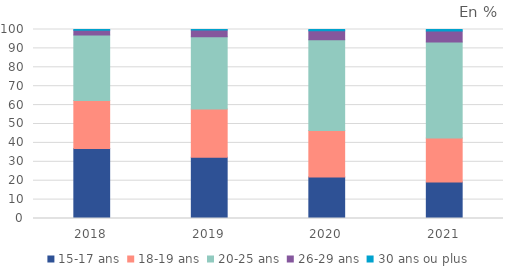
| Category | 15-17 ans | 18-19 ans | 20-25 ans | 26-29 ans | 30 ans ou plus |
|---|---|---|---|---|---|
| 2018.0 | 37 | 25.4 | 34.7 | 2.5 | 0.4 |
| 2019.0 | 32.4 | 25.5 | 38.3 | 3.5 | 0.4 |
| 2020.0 | 21.9 | 24.7 | 48 | 4.8 | 0.6 |
| 2021.0 | 19.3 | 23.3 | 50.8 | 5.8 | 0.8 |